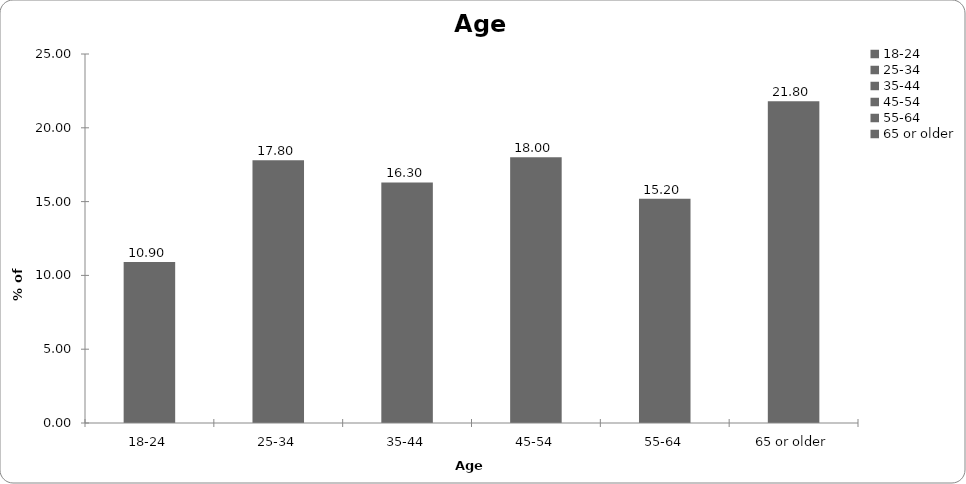
| Category | Age |
|---|---|
| 18-24 | 10.9 |
| 25-34 | 17.8 |
| 35-44 | 16.3 |
| 45-54 | 18 |
| 55-64 | 15.2 |
| 65 or older | 21.8 |